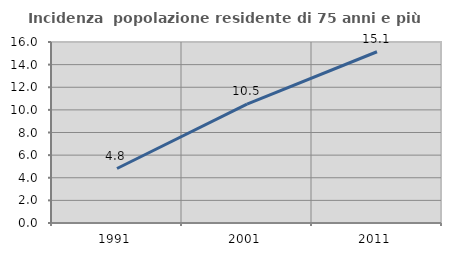
| Category | Incidenza  popolazione residente di 75 anni e più |
|---|---|
| 1991.0 | 4.816 |
| 2001.0 | 10.516 |
| 2011.0 | 15.137 |